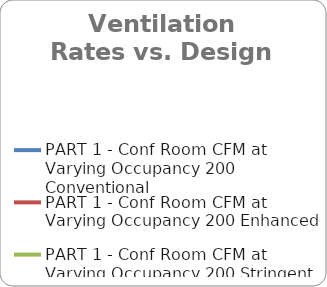
| Category | PART 1 - Conf Room CFM at Varying Occupancy |
|---|---|
| 0.0 | 30 |
| 1.0 | 30 |
| 2.0 | 30 |
| 3.0 | 45 |
| 4.0 | 60 |
| 5.0 | 75 |
| 6.0 | 90 |
| 7.0 | 105 |
| 8.0 | 120 |
| 9.0 | 135 |
| 10.0 | 150 |